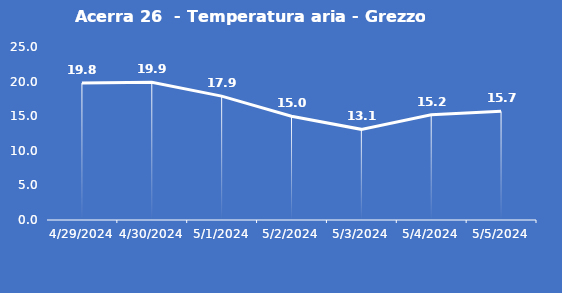
| Category | Acerra 26  - Temperatura aria - Grezzo (°C) |
|---|---|
| 4/29/24 | 19.8 |
| 4/30/24 | 19.9 |
| 5/1/24 | 17.9 |
| 5/2/24 | 15 |
| 5/3/24 | 13.1 |
| 5/4/24 | 15.2 |
| 5/5/24 | 15.7 |